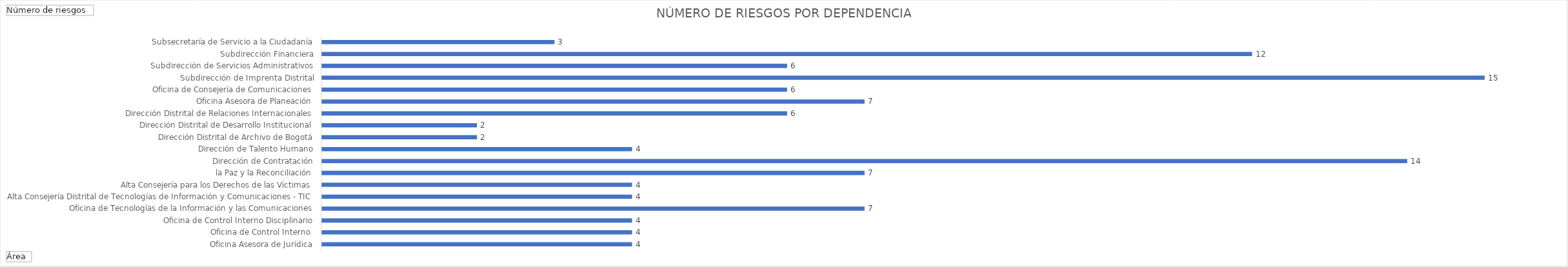
| Category | Total |
|---|---|
|  Oficina Asesora de Jurídica | 4 |
|  Oficina de Control Interno  | 4 |
|  Oficina de Control Interno Disciplinario | 4 |
|  Oficina de Tecnologías de la Información y las Comunicaciones | 7 |
| Alta Consejería Distrital de Tecnologías de Información y Comunicaciones - TIC | 4 |
| Alta Consejería para los Derechos de las Víctimas, la Paz y la Reconciliación | 4 |
| Dirección de Contratación | 7 |
| Dirección de Talento Humano | 14 |
| Dirección Distrital de Archivo de Bogotá | 4 |
| Dirección Distrital de Desarrollo Institucional | 2 |
| Dirección Distrital de Relaciones Internacionales | 2 |
| Oficina Asesora de Planeación | 6 |
| Oficina de Consejería de Comunicaciones | 7 |
| Subdirección de Imprenta Distrital | 6 |
| Subdirección de Servicios Administrativos | 15 |
| Subdirección Financiera | 6 |
| Subsecretaría de Servicio a la Ciudadanía | 12 |
| Subsecretaría Distrital de Fortalecimiento Institucional | 3 |